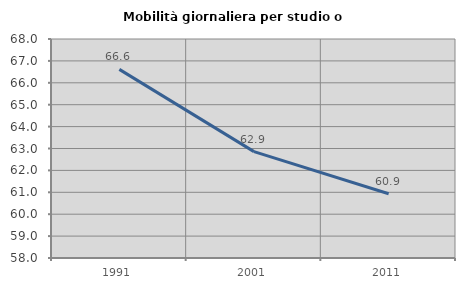
| Category | Mobilità giornaliera per studio o lavoro |
|---|---|
| 1991.0 | 66.613 |
| 2001.0 | 62.858 |
| 2011.0 | 60.933 |